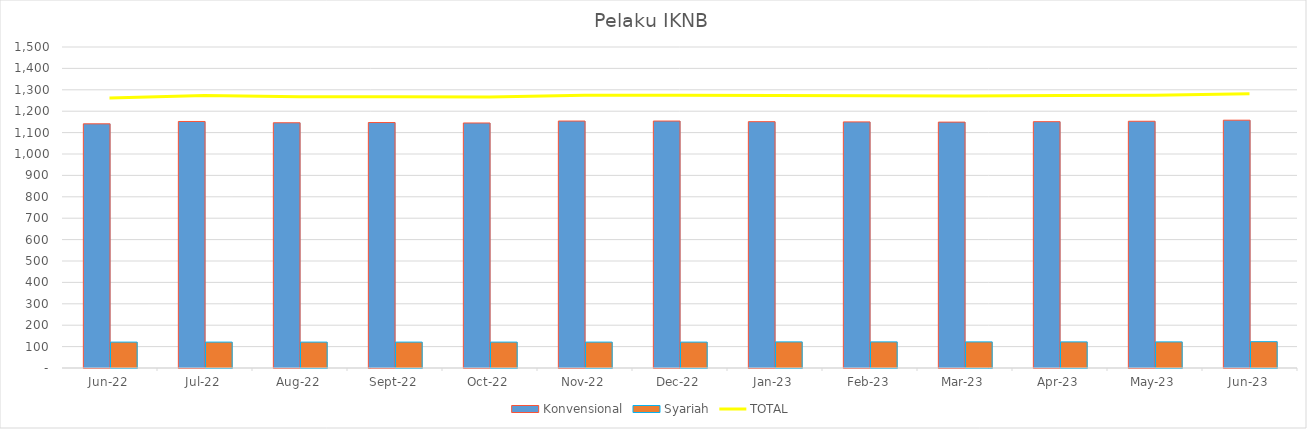
| Category |  Konvensional  |  Syariah  |
|---|---|---|
| 2022-06-01 | 1141 | 121 |
| 2022-07-01 | 1152 | 121 |
| 2022-08-01 | 1146 | 121 |
| 2022-09-01 | 1147 | 121 |
| 2022-10-01 | 1145 | 121 |
| 2022-11-01 | 1154 | 121 |
| 2022-12-01 | 1154 | 121 |
| 2023-01-01 | 1151 | 122 |
| 2023-02-01 | 1150 | 122 |
| 2023-03-01 | 1149 | 122 |
| 2023-04-01 | 1151 | 122 |
| 2023-05-01 | 1153 | 122 |
| 2023-06-01 | 1158 | 123 |